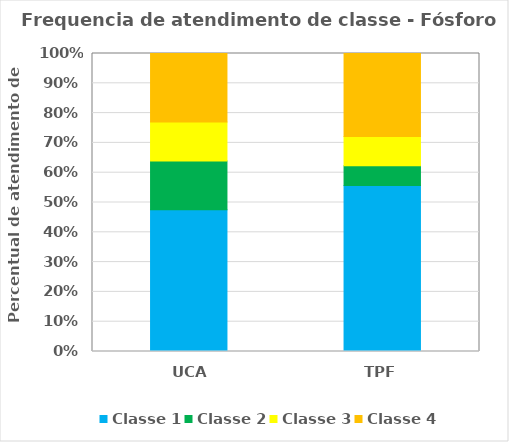
| Category | Classe 1 | Classe 2 | Classe 3 | Classe 4 |
|---|---|---|---|---|
| UCA | 0.475 | 0.164 | 0.131 | 0.23 |
| TPF | 0.557 | 0.066 | 0.098 | 0.279 |